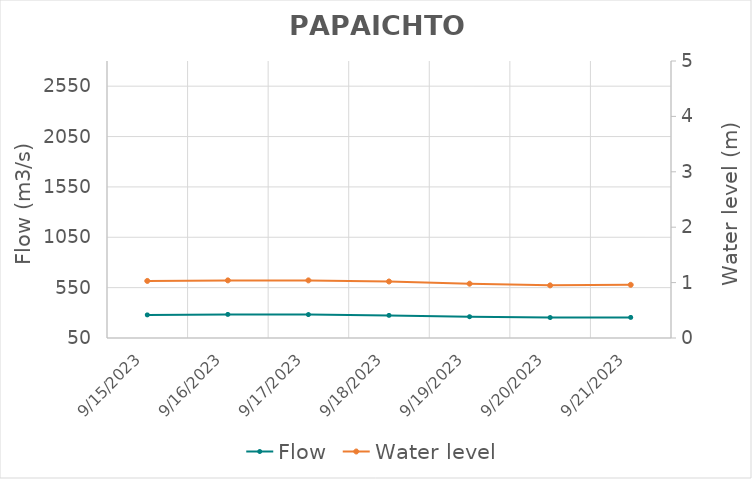
| Category | Flow |
|---|---|
| 7/20/23 | 837.27 |
| 7/19/23 | 849.27 |
| 7/18/23 | 832.69 |
| 7/17/23 | 822.17 |
| 7/16/23 | 820.25 |
| 7/15/23 | 831.71 |
| 7/14/23 | 917.4 |